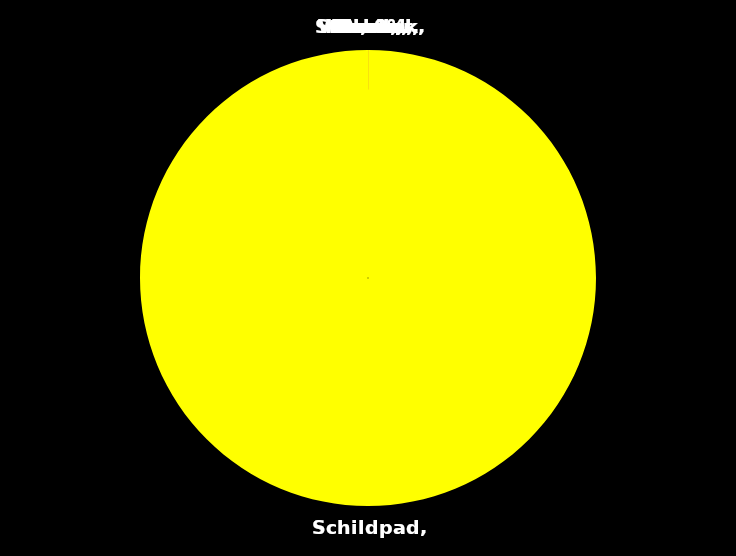
| Category | Series 0 |
|---|---|
| Leeuw | 0 |
| Bever | 0 |
| Pauw | 0 |
| Wasbeer | 0 |
| Poes | 0 |
| Kameel | 0 |
| Schildpad | 0.022 |
| Steenbok | 0 |
| Havik | 0 |
| Uil | 0 |